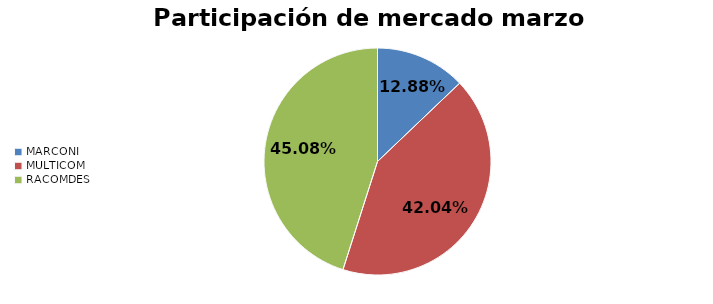
| Category | Series 0 |
|---|---|
| MARCONI | 0.129 |
| MULTICOM | 0.42 |
| RACOMDES | 0.451 |